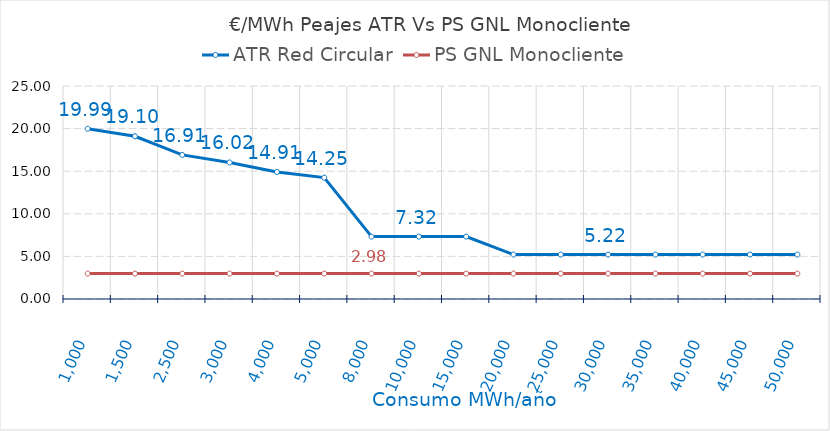
| Category | ATR Red Circular | PS GNL Monocliente |
|---|---|---|
| 1000.0 | 19.986 | 2.981 |
| 1500.0 | 19.098 | 2.981 |
| 2500.0 | 16.911 | 2.981 |
| 3000.0 | 16.023 | 2.981 |
| 4000.0 | 14.912 | 2.981 |
| 5000.0 | 14.245 | 2.981 |
| 8000.0 | 7.322 | 2.981 |
| 10000.0 | 7.322 | 2.981 |
| 15000.0 | 7.322 | 2.981 |
| 20000.0 | 5.216 | 2.981 |
| 25000.0 | 5.216 | 2.981 |
| 30000.0 | 5.216 | 2.981 |
| 35000.0 | 5.216 | 2.981 |
| 40000.0 | 5.216 | 2.981 |
| 45000.0 | 5.216 | 2.981 |
| 50000.0 | 5.216 | 2.981 |